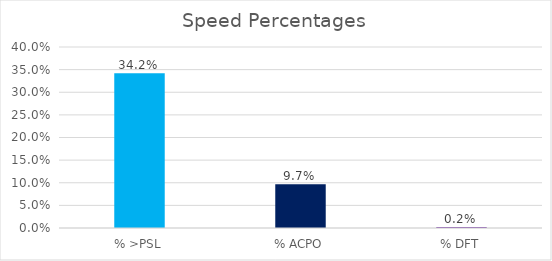
| Category | Series 0 |
|---|---|
| % >PSL | 0.342 |
| % ACPO | 0.097 |
| % DFT | 0.002 |